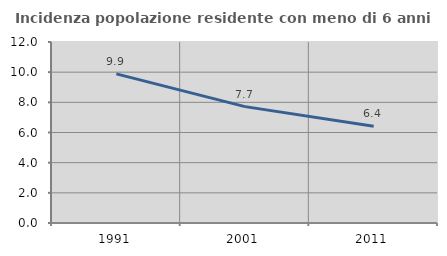
| Category | Incidenza popolazione residente con meno di 6 anni |
|---|---|
| 1991.0 | 9.888 |
| 2001.0 | 7.716 |
| 2011.0 | 6.408 |